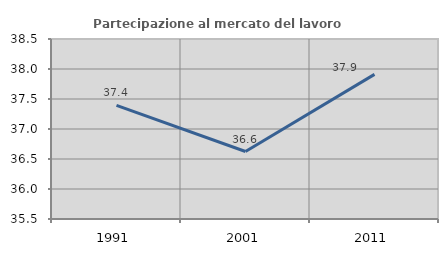
| Category | Partecipazione al mercato del lavoro  femminile |
|---|---|
| 1991.0 | 37.393 |
| 2001.0 | 36.625 |
| 2011.0 | 37.91 |